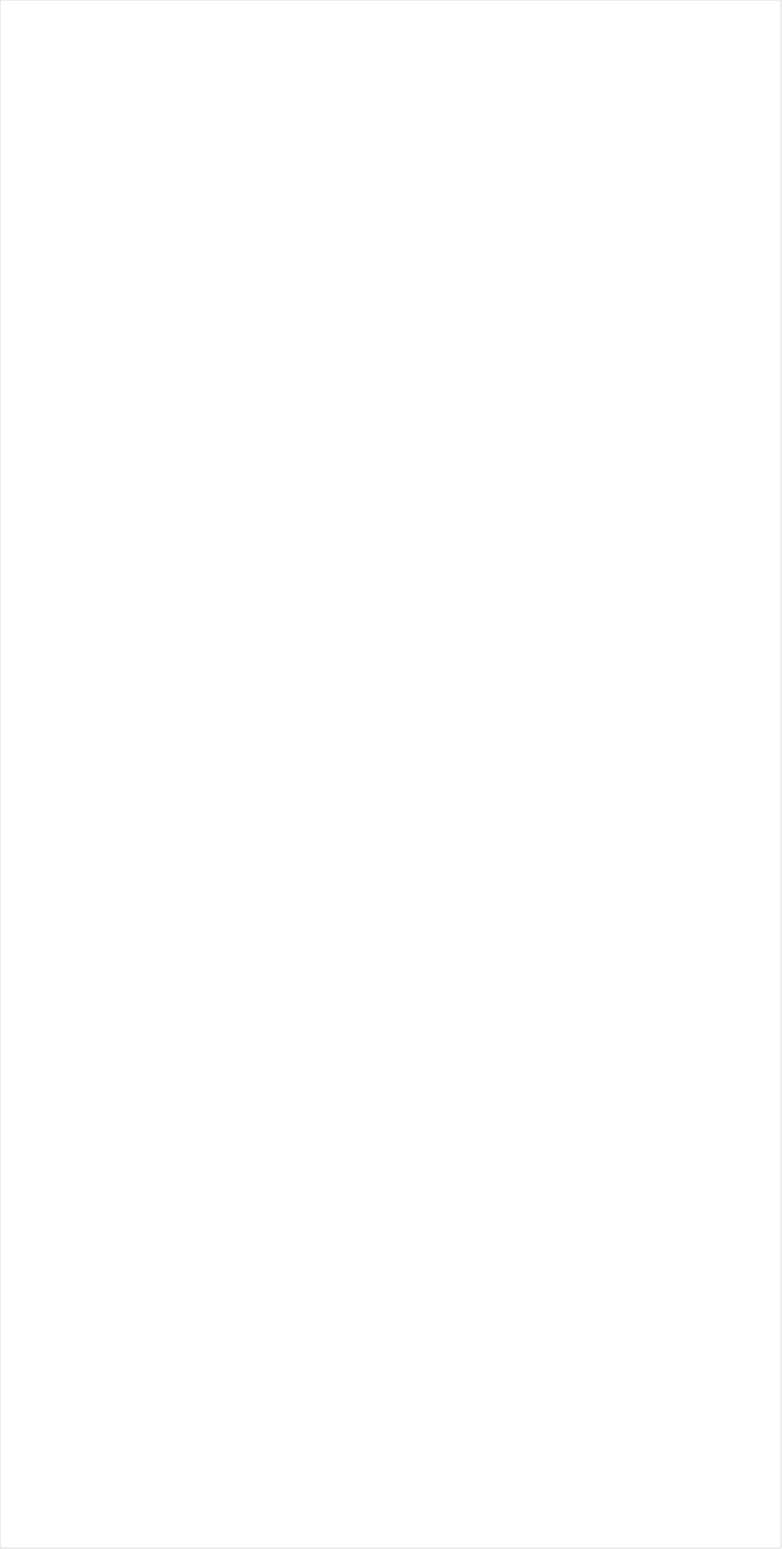
| Category | Total |
|---|---|
| PBS | -0.29 |
| INSP | -0.179 |
| Hallmark Movies & Mysteries | -0.168 |
| Fox Business | -0.146 |
| RFD TV | -0.143 |
| Bloomberg HD | -0.134 |
| Hallmark | -0.099 |
| Great American Country | -0.097 |
| Smithsonian | -0.089 |
| MSNBC | -0.084 |
| Discovery Life Channel | -0.083 |
| CBS | -0.081 |
| Tennis Channel | -0.076 |
| Weather Channel | -0.07 |
| WGN America | -0.067 |
| UP TV | -0.063 |
| Fox News | -0.062 |
| TV LAND | -0.06 |
| Outdoor Channel | -0.047 |
| ION | -0.044 |
| SundanceTV | -0.041 |
| Golf | -0.041 |
| HGTV | -0.04 |
| Game Show | -0.04 |
| FOX Sports 2 | -0.035 |
| CNBC | -0.034 |
| Headline News | -0.026 |
| Science Channel | -0.025 |
| NBC | -0.024 |
| American Heroes Channel | -0.024 |
| ABC | -0.024 |
| DIY | -0.019 |
| National Geographic Wild | -0.019 |
| National Geographic | -0.018 |
| OXYGEN | -0.018 |
| History Channel | -0.017 |
| Animal Planet | -0.016 |
| Ovation | -0.013 |
| FYI | -0.01 |
| Motor Trend Network | -0.005 |
| Reelz Channel | -0.003 |
| Big Ten Network | -0.002 |
| PAC-12 Network | -0.001 |
| Disney Junior US | -0.001 |
| Fox Sports 1 | -0.001 |
| BBC America | 0.002 |
| CNN | 0.003 |
| CMTV | 0.004 |
| POP | 0.006 |
| Olympic Channel | 0.011 |
| Travel | 0.012 |
| CW | 0.012 |
| FXDEP | 0.016 |
| Galavision | 0.017 |
| FX Movie Channel | 0.019 |
| CBS Sports | 0.019 |
| Oprah Winfrey Network | 0.02 |
| The Sportsman Channel | 0.021 |
| Lifetime Movies | 0.021 |
| Food Network | 0.023 |
| Investigation Discovery | 0.024 |
| TLC | 0.024 |
| Nick Jr. | 0.025 |
| Independent Film (IFC) | 0.027 |
| FOX | 0.027 |
| Discovery Channel | 0.031 |
| Lifetime | 0.033 |
| NHL | 0.033 |
| Destination America | 0.033 |
| USA Network | 0.035 |
| NBC Sports | 0.035 |
| TBS | 0.036 |
| NFL Network | 0.036 |
| SYFY | 0.037 |
| A&E | 0.038 |
| UniMas | 0.04 |
| Cooking Channel | 0.042 |
| E! | 0.043 |
| WE TV | 0.045 |
| NBC Universo | 0.045 |
| AMC | 0.045 |
| Viceland | 0.045 |
| BRAVO | 0.049 |
| FX | 0.051 |
| MTV2 | 0.054 |
| Paramount Network | 0.054 |
| Telemundo | 0.054 |
| FXX | 0.057 |
| Univision | 0.059 |
| TUDN | 0.06 |
| Discovery Family Channel | 0.061 |
| TNT | 0.061 |
| ESPNU | 0.064 |
| Adult Swim | 0.067 |
| ESPN | 0.067 |
| NBA TV | 0.071 |
| Freeform | 0.072 |
| MTV | 0.076 |
| ESPN Deportes | 0.076 |
| Comedy Central | 0.078 |
| MLB Network | 0.079 |
| Logo | 0.079 |
| Universal Kids | 0.086 |
| VH1 | 0.087 |
| BET | 0.09 |
| truTV | 0.095 |
| Nick@Nite | 0.095 |
| ESPN2 | 0.096 |
| BET Her | 0.097 |
| ESPNEWS | 0.103 |
| Nick | 0.109 |
| Nick Toons | 0.111 |
| MyNetworkTV | 0.113 |
| TV ONE | 0.118 |
| Disney XD | 0.133 |
| Disney Channel | 0.156 |
| Teen Nick | 0.162 |
| Cartoon Network | 0.44 |